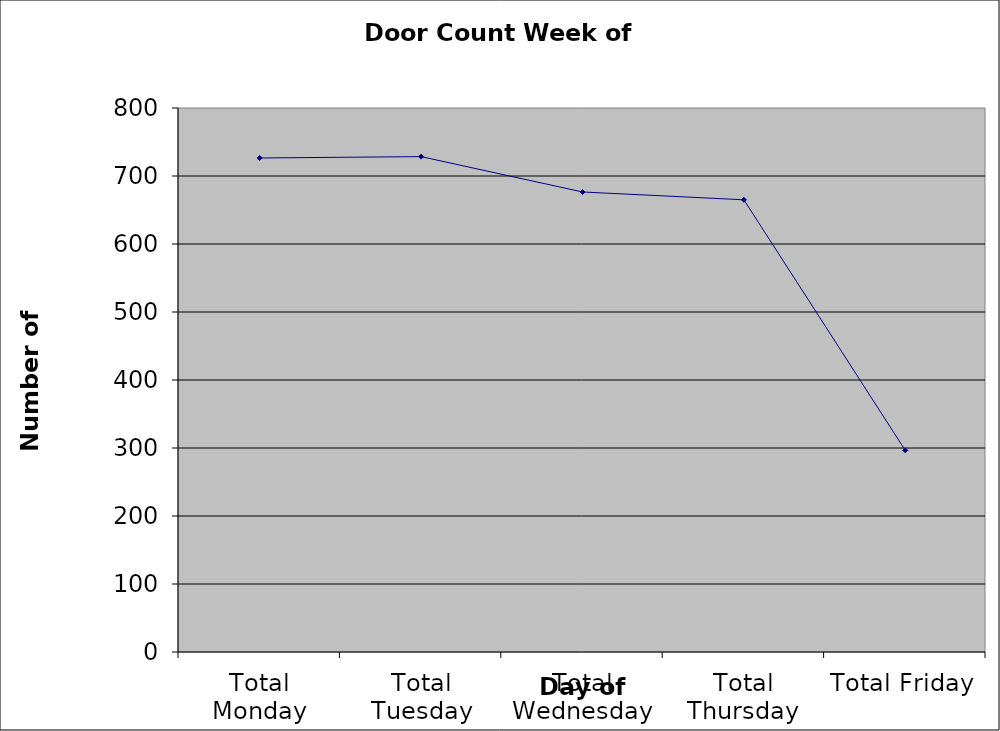
| Category | Series 0 |
|---|---|
| Total Monday | 726.5 |
| Total Tuesday | 728.5 |
| Total Wednesday | 676.5 |
| Total Thursday | 665 |
| Total Friday | 296.5 |